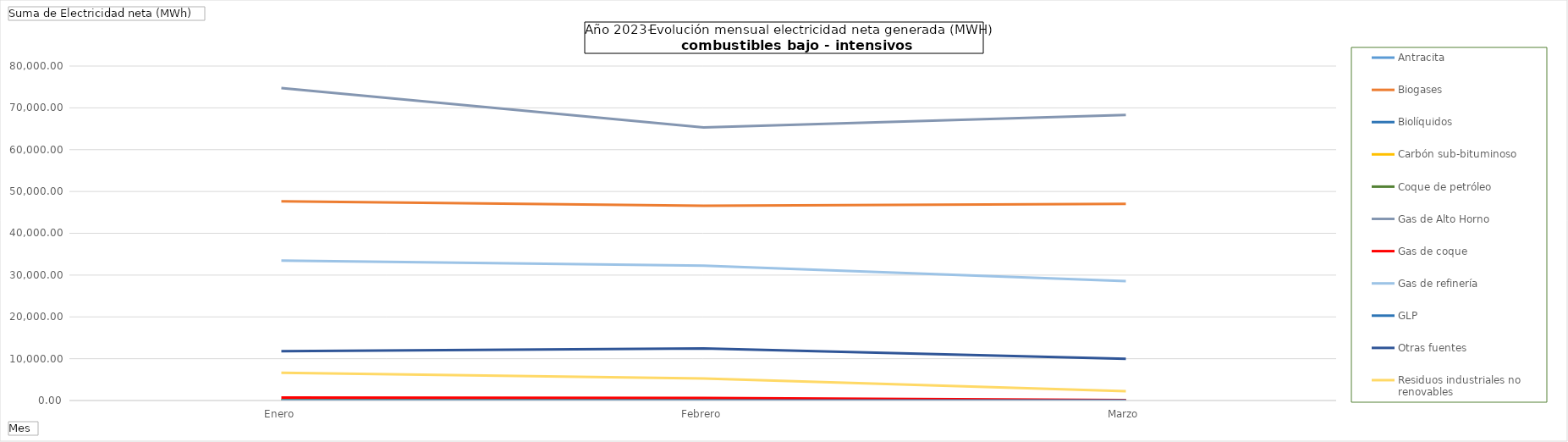
| Category | Antracita | Biogases | Biolíquidos | Carbón sub-bituminoso | Coque de petróleo | Gas de Alto Horno | Gas de coque | Gas de refinería | GLP | Otras fuentes | Residuos industriales no renovables |
|---|---|---|---|---|---|---|---|---|---|---|---|
| Enero | 0 | 47632.3 | 0 | 0 | 0 | 74745.43 | 720.6 | 33458.85 | 0 | 11799.42 | 6631.76 |
| Febrero | 0 | 46605.35 | 0 | 0 | 0 | 65315.19 | 629.99 | 32266.94 | 0 | 12436.26 | 5245.29 |
| Marzo | 0 | 47047.55 | 0 | 0 | 0 | 68303.02 | 103.04 | 28557.85 | 0.05 | 9973.56 | 2240.06 |